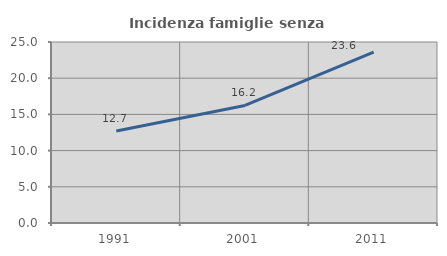
| Category | Incidenza famiglie senza nuclei |
|---|---|
| 1991.0 | 12.707 |
| 2001.0 | 16.232 |
| 2011.0 | 23.602 |